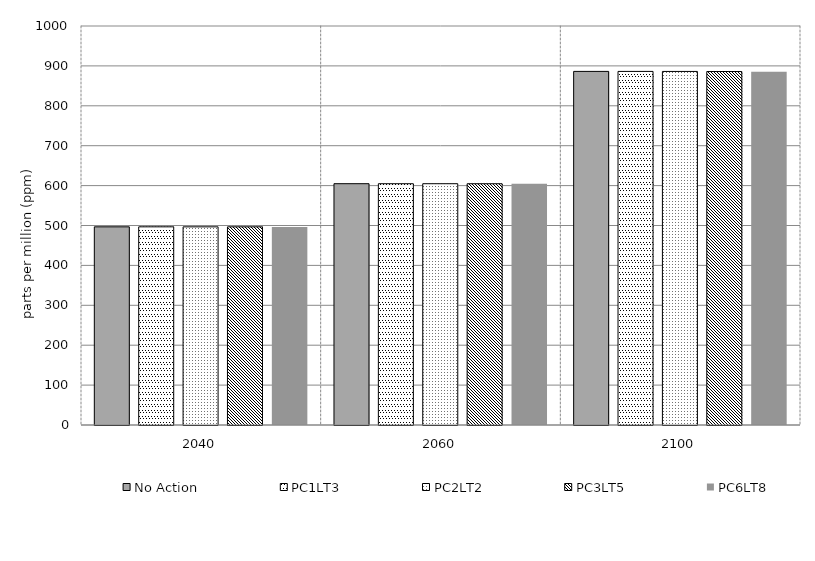
| Category | No Action | PC1LT3 | PC2LT2 | PC3LT5 | PC6LT8 | Alt 5 | Alt 6 | Alt 7 | Alt 8 | Alt 10 |
|---|---|---|---|---|---|---|---|---|---|---|
| 2040.0 | 496.649 | 496.637 | 496.629 | 496.611 | 496.549 |  |  |  |  |  |
| 2060.0 | 604.768 | 604.749 | 604.718 | 604.65 | 604.41 |  |  |  |  |  |
| 2100.0 | 886.213 | 886.182 | 886.094 | 885.92 | 885.304 |  |  |  |  |  |